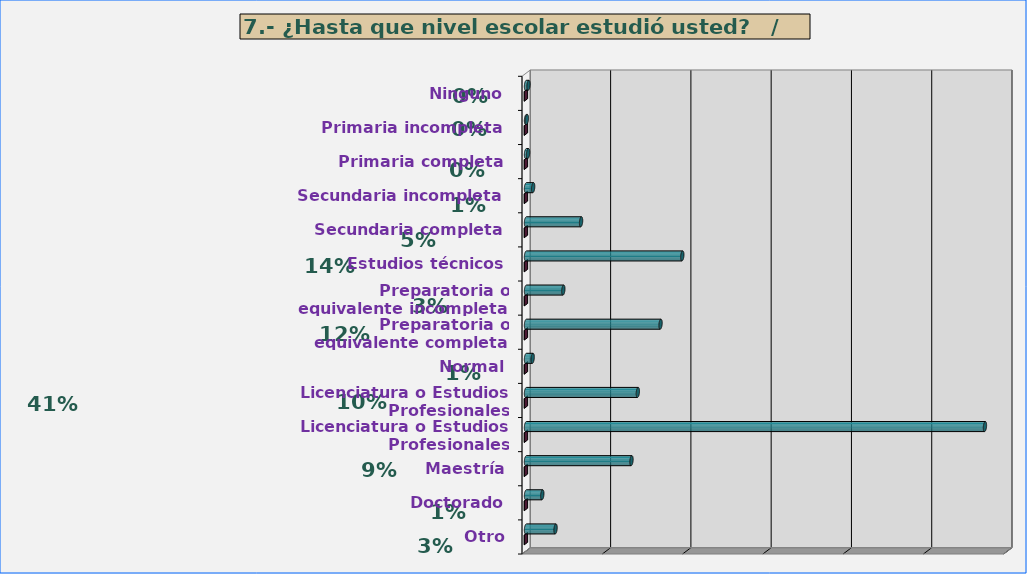
| Category | Series 0 | Series 1 |
|---|---|---|
| Ninguno | 31 | 0.002 |
| Primaria incompleta | 11 | 0.001 |
| Primaria completa | 26 | 0.002 |
| Secundaria incompleta | 89 | 0.006 |
| Secundaria completa | 686 | 0.049 |
| Estudios técnicos | 1947 | 0.139 |
| Preparatoria o equivalente incompleta | 465 | 0.033 |
| Preparatoria o equivalente completa | 1676 | 0.12 |
| Normal | 83 | 0.006 |
| Licenciatura o Estudios Profesionales incompletos | 1393 | 0.099 |
| Licenciatura o Estudios Profesionales completos | 5717 | 0.408 |
| Maestría | 1314 | 0.094 |
| Doctorado | 203 | 0.014 |
| Otro | 368 | 0.026 |